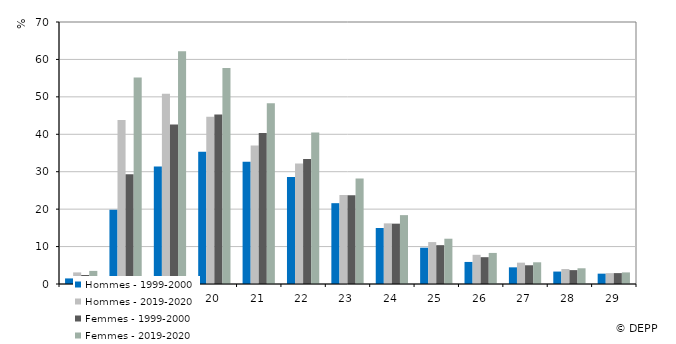
| Category | Hommes - 1999-2000 | Hommes - 2019-2020 | Femmes - 1999-2000 | Femmes - 2019-2020 |
|---|---|---|---|---|
| 17.0 | 1.49 | 3.1 | 2.411 | 3.5 |
| 18.0 | 19.835 | 43.8 | 29.339 | 55.2 |
| 19.0 | 31.36 | 50.8 | 42.609 | 62.2 |
| 20.0 | 35.354 | 44.7 | 45.265 | 57.7 |
| 21.0 | 32.651 | 37 | 40.361 | 48.3 |
| 22.0 | 28.597 | 32.2 | 33.382 | 40.5 |
| 23.0 | 21.593 | 23.8 | 23.707 | 28.2 |
| 24.0 | 14.969 | 16.2 | 16.123 | 18.4 |
| 25.0 | 9.701 | 11.2 | 10.377 | 12.1 |
| 26.0 | 5.892 | 7.8 | 7.165 | 8.3 |
| 27.0 | 4.451 | 5.7 | 5.005 | 5.8 |
| 28.0 | 3.323 | 4 | 3.708 | 4.2 |
| 29.0 | 2.764 | 2.9 | 2.912 | 3.1 |